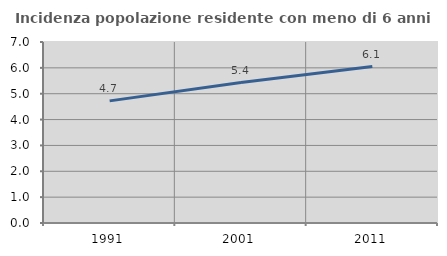
| Category | Incidenza popolazione residente con meno di 6 anni |
|---|---|
| 1991.0 | 4.723 |
| 2001.0 | 5.432 |
| 2011.0 | 6.052 |